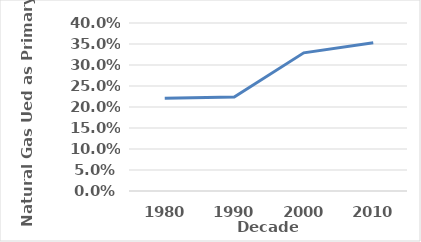
| Category | Series 0 |
|---|---|
| 1980.0 | 0.221 |
| 1990.0 | 0.224 |
| 2000.0 | 0.329 |
| 2010.0 | 0.353 |